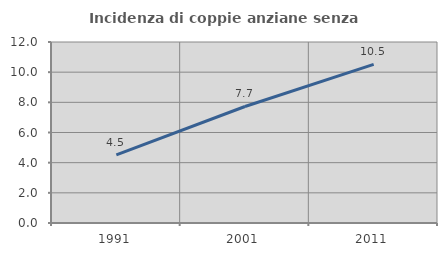
| Category | Incidenza di coppie anziane senza figli  |
|---|---|
| 1991.0 | 4.51 |
| 2001.0 | 7.725 |
| 2011.0 | 10.522 |